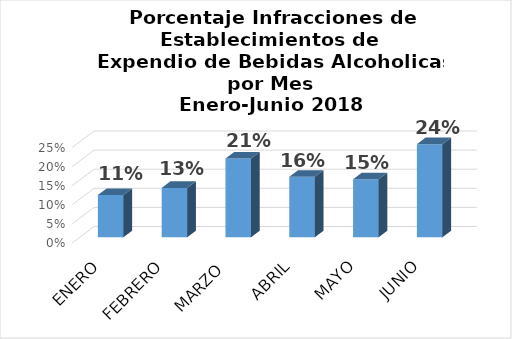
| Category | Series 0 |
|---|---|
| ENERO | 0.111 |
| FEBRERO | 0.129 |
| MARZO  | 0.206 |
| ABRIL | 0.158 |
| MAYO | 0.152 |
| JUNIO | 0.244 |